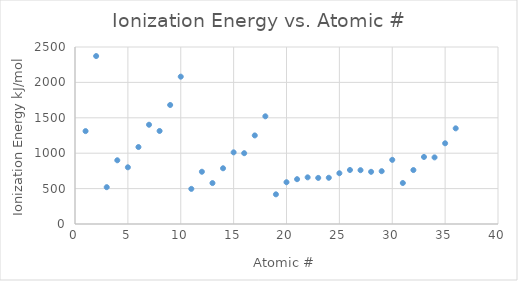
| Category | Series 0 |
|---|---|
| 1.0 | 1312 |
| 2.0 | 2372 |
| 3.0 | 520 |
| 4.0 | 900 |
| 5.0 | 801 |
| 6.0 | 1087 |
| 7.0 | 1402 |
| 8.0 | 1314 |
| 9.0 | 1681 |
| 10.0 | 2081 |
| 11.0 | 496 |
| 12.0 | 738 |
| 13.0 | 578 |
| 14.0 | 787 |
| 15.0 | 1012 |
| 16.0 | 1000 |
| 17.0 | 1251 |
| 18.0 | 1521 |
| 19.0 | 419 |
| 20.0 | 590 |
| 21.0 | 633 |
| 22.0 | 659 |
| 23.0 | 651 |
| 24.0 | 653 |
| 25.0 | 717 |
| 26.0 | 763 |
| 27.0 | 760 |
| 28.0 | 737 |
| 29.0 | 746 |
| 30.0 | 906 |
| 31.0 | 579 |
| 32.0 | 762 |
| 33.0 | 947 |
| 34.0 | 941 |
| 35.0 | 1140 |
| 36.0 | 1351 |